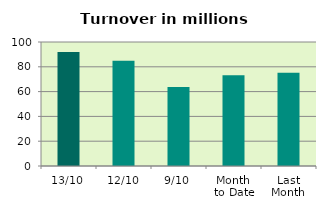
| Category | Series 0 |
|---|---|
| 13/10 | 92.019 |
| 12/10 | 84.873 |
| 9/10 | 63.746 |
| Month 
to Date | 73.195 |
| Last
Month | 75.235 |